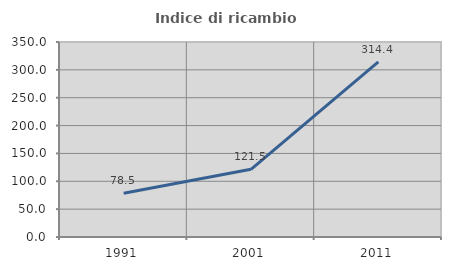
| Category | Indice di ricambio occupazionale  |
|---|---|
| 1991.0 | 78.498 |
| 2001.0 | 121.501 |
| 2011.0 | 314.354 |